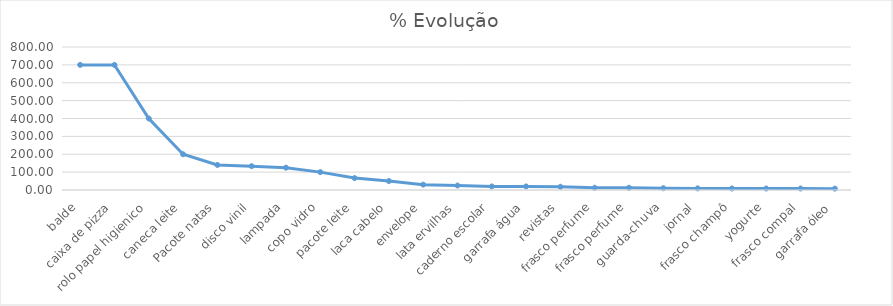
| Category | % Evolução |
|---|---|
| balde | 700 |
| caixa de pizza | 700 |
| rolo papel higienico | 400 |
| caneca leite | 200 |
| Pacote natas | 140 |
| disco vinil | 133.333 |
| lampada | 125 |
| copo vidro | 100 |
| pacote leite | 66.667 |
| laca cabelo | 50 |
| envelope | 30 |
| lata ervilhas | 25 |
| caderno escolar | 20 |
| garrafa água | 20 |
| revistas | 18.182 |
| frasco perfume | 12.5 |
| frasco perfume | 12.5 |
| guarda-chuva | 10 |
| jornal | 9.091 |
| frasco champô | 8.333 |
| yogurte | 8.333 |
| frasco compal | 8.333 |
| garrafa óleo | 7.692 |